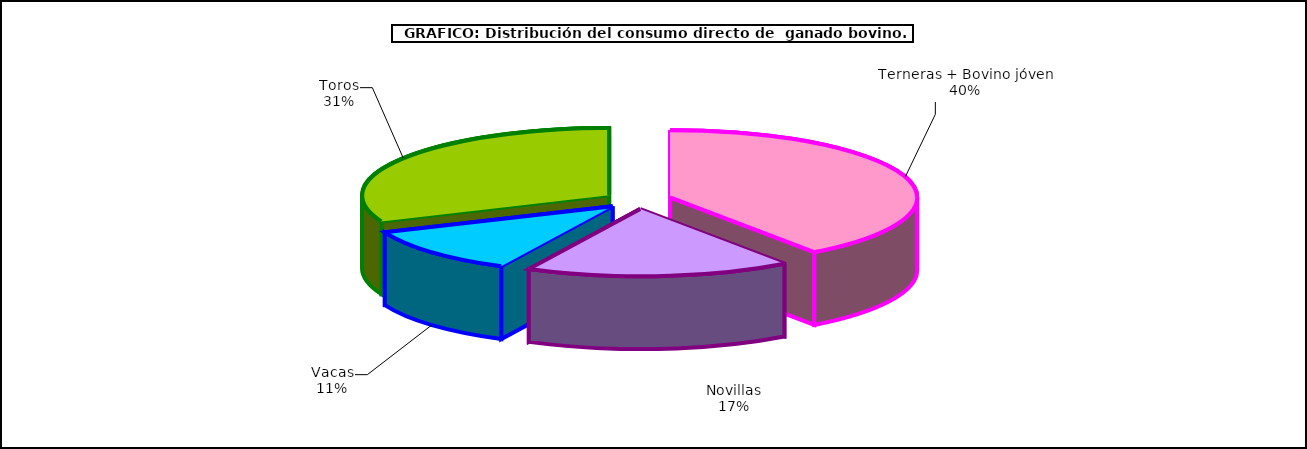
| Category | Series 0 |
|---|---|
| Terneras + Bovino jóven | 239010.934 |
| Novillas | 103481.282 |
| Vacas | 66894.295 |
| Toros | 186864.133 |